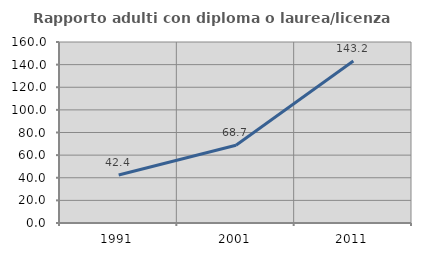
| Category | Rapporto adulti con diploma o laurea/licenza media  |
|---|---|
| 1991.0 | 42.432 |
| 2001.0 | 68.669 |
| 2011.0 | 143.236 |